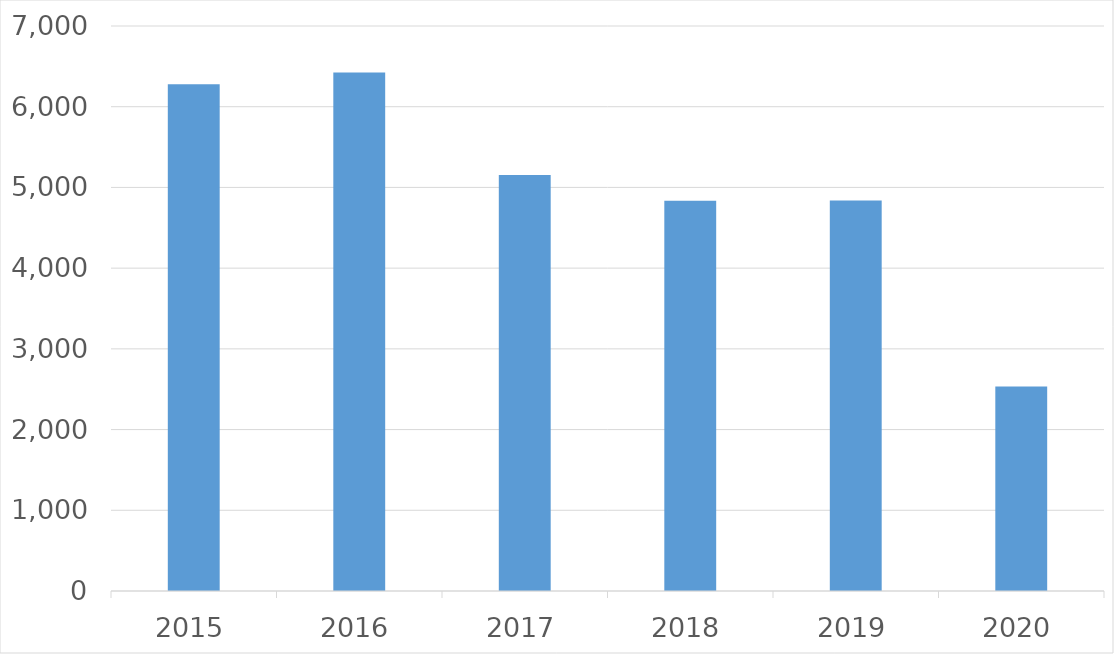
| Category | Series 0 |
|---|---|
| 2015 | 6279 |
| 2016 | 6425 |
| 2017 | 5155 |
| 2018 | 4834 |
| 2019 | 4838 |
| 2020 | 2533 |